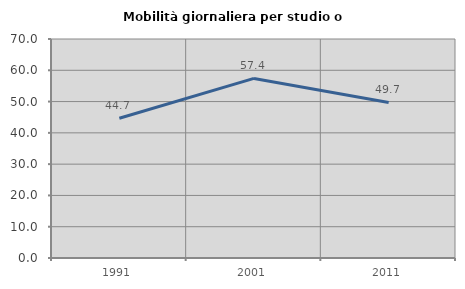
| Category | Mobilità giornaliera per studio o lavoro |
|---|---|
| 1991.0 | 44.672 |
| 2001.0 | 57.399 |
| 2011.0 | 49.719 |